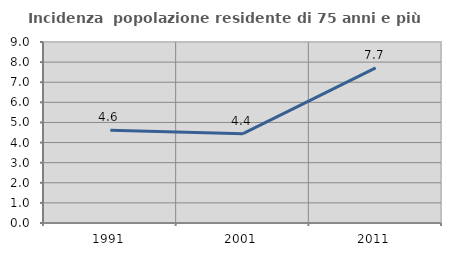
| Category | Incidenza  popolazione residente di 75 anni e più |
|---|---|
| 1991.0 | 4.614 |
| 2001.0 | 4.443 |
| 2011.0 | 7.711 |